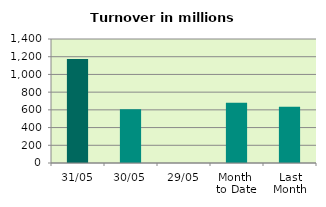
| Category | Series 0 |
|---|---|
| 31/05 | 1173.774 |
| 30/05 | 607.923 |
| 29/05 | 0 |
| Month 
to Date | 679.973 |
| Last
Month | 634.312 |